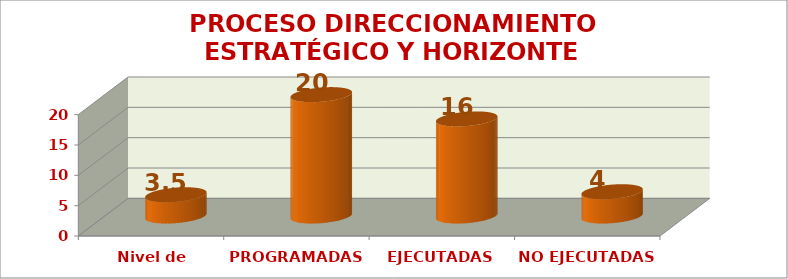
| Category | PROCESO DIRECCIONAMIENTO ESTRATÉGICO Y HORIZONTE INSTITUCIONAL |
|---|---|
| Nivel de satisfacción | 3.5 |
| PROGRAMADAS | 20 |
| EJECUTADAS | 16 |
| NO EJECUTADAS | 4 |